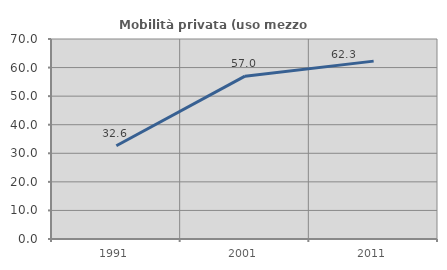
| Category | Mobilità privata (uso mezzo privato) |
|---|---|
| 1991.0 | 32.622 |
| 2001.0 | 56.998 |
| 2011.0 | 62.259 |